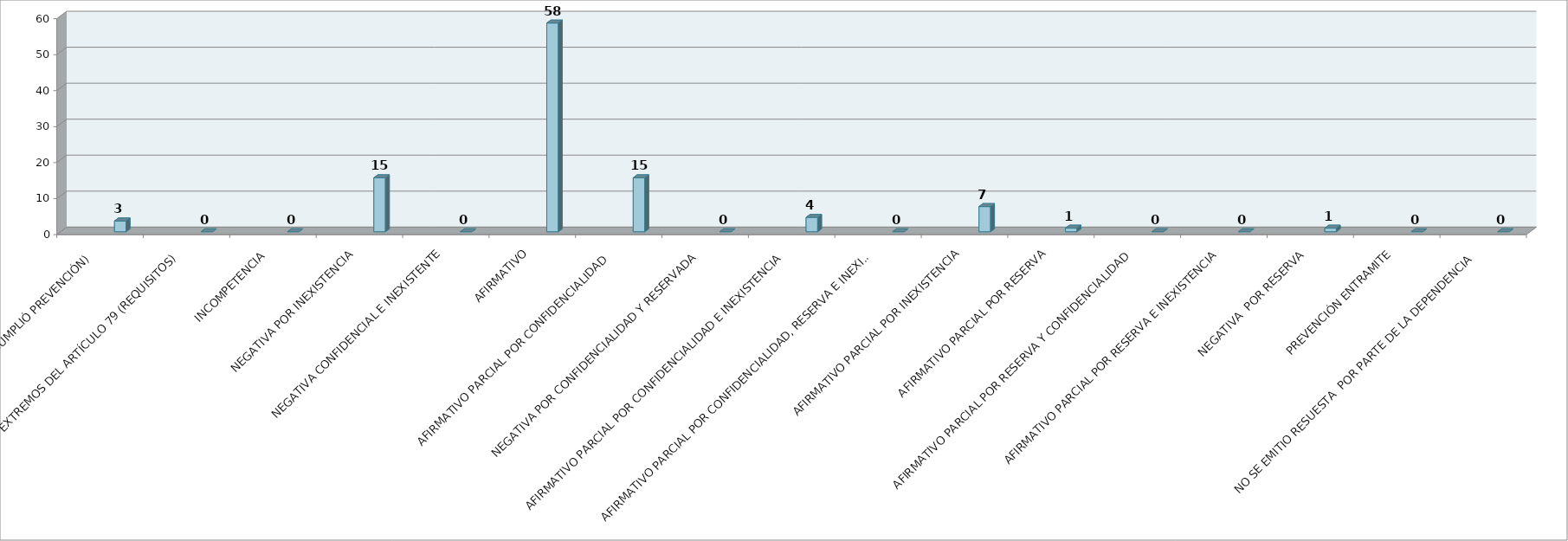
| Category | Series 0 | Series 1 | Series 2 | Series 3 | Series 4 | Series 5 |
|---|---|---|---|---|---|---|
| SE TIENE POR NO PRESENTADA ( NO CUMPLIÓ PREVENCIÓN) |  |  |  |  | 3 |  |
| NO CUMPLIO CON LOS EXTREMOS DEL ARTÍCULO 79 (REQUISITOS) |  |  |  |  | 0 |  |
| INCOMPETENCIA  |  |  |  |  | 0 |  |
| NEGATIVA POR INEXISTENCIA |  |  |  |  | 15 |  |
| NEGATIVA CONFIDENCIAL E INEXISTENTE |  |  |  |  | 0 |  |
| AFIRMATIVO |  |  |  |  | 58 |  |
| AFIRMATIVO PARCIAL POR CONFIDENCIALIDAD  |  |  |  |  | 15 |  |
| NEGATIVA POR CONFIDENCIALIDAD Y RESERVADA |  |  |  |  | 0 |  |
| AFIRMATIVO PARCIAL POR CONFIDENCIALIDAD E INEXISTENCIA |  |  |  |  | 4 |  |
| AFIRMATIVO PARCIAL POR CONFIDENCIALIDAD, RESERVA E INEXISTENCIA |  |  |  |  | 0 |  |
| AFIRMATIVO PARCIAL POR INEXISTENCIA |  |  |  |  | 7 |  |
| AFIRMATIVO PARCIAL POR RESERVA |  |  |  |  | 1 |  |
| AFIRMATIVO PARCIAL POR RESERVA Y CONFIDENCIALIDAD |  |  |  |  | 0 |  |
| AFIRMATIVO PARCIAL POR RESERVA E INEXISTENCIA |  |  |  |  | 0 |  |
| NEGATIVA  POR RESERVA |  |  |  |  | 1 |  |
| PREVENCIÓN ENTRAMITE |  |  |  |  | 0 |  |
| NO SE EMITIO RESUESTA  POR PARTE DE LA DEPENDENCIA |  |  |  |  | 0 |  |